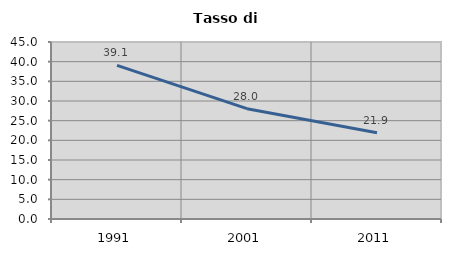
| Category | Tasso di disoccupazione   |
|---|---|
| 1991.0 | 39.063 |
| 2001.0 | 28.049 |
| 2011.0 | 21.92 |